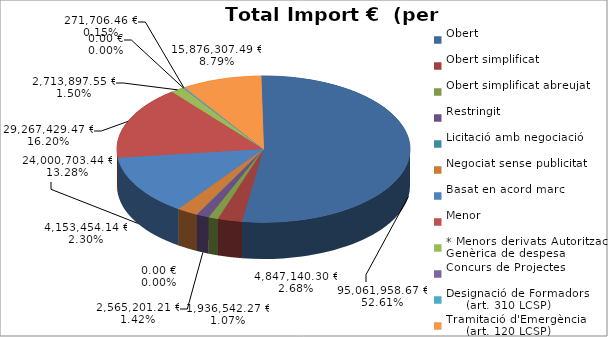
| Category | Total preu
(amb IVA) |
|---|---|
| Obert | 95061958.67 |
| Obert simplificat | 4847140.3 |
| Obert simplificat abreujat | 1936542.27 |
| Restringit | 2565201.21 |
| Licitació amb negociació | 0 |
| Negociat sense publicitat | 4153454.14 |
| Basat en acord marc | 24000703.44 |
| Menor | 29267429.47 |
| * Menors derivats Autorització Genèrica de despesa | 2713897.55 |
| Concurs de Projectes | 0 |
| Designació de Formadors
     (art. 310 LCSP) | 271706.46 |
| Tramitació d'Emergència
     (art. 120 LCSP) | 15876307.49 |